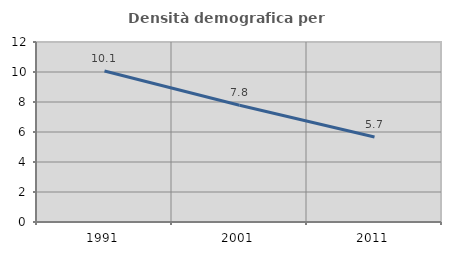
| Category | Densità demografica |
|---|---|
| 1991.0 | 10.064 |
| 2001.0 | 7.786 |
| 2011.0 | 5.667 |